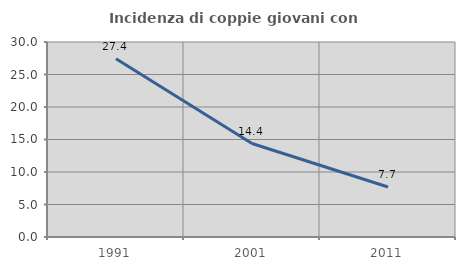
| Category | Incidenza di coppie giovani con figli |
|---|---|
| 1991.0 | 27.419 |
| 2001.0 | 14.378 |
| 2011.0 | 7.692 |